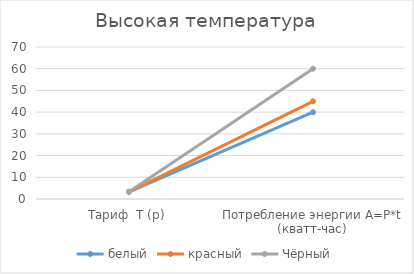
| Category | белый | красный | Чёрный |
|---|---|---|---|
| Тариф  Т (р) | 3.3 | 3.3 | 3.3 |
| Потребление энергии A=P*t (кватт-час) | 40 | 45 | 60 |